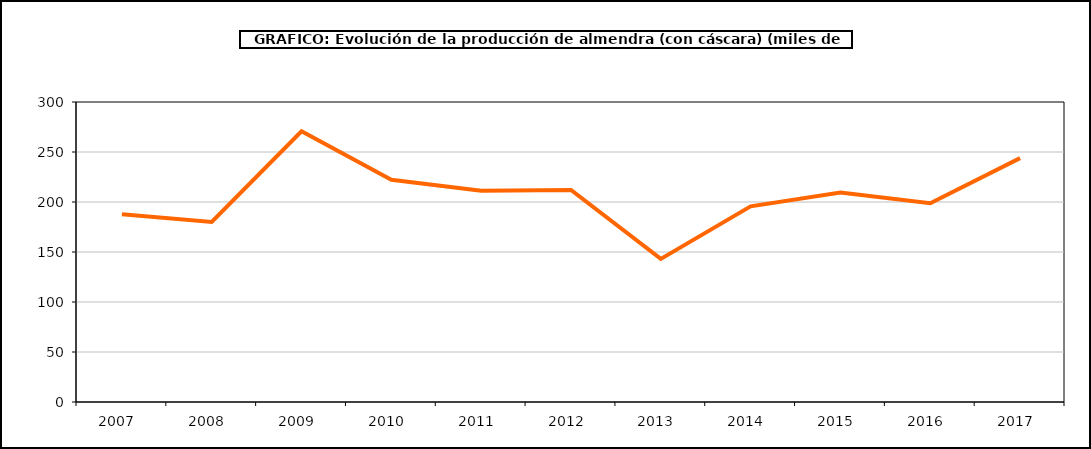
| Category | producción almendro |
|---|---|
| 2007.0 | 187.656 |
| 2008.0 | 180.103 |
| 2009.0 | 270.686 |
| 2010.0 | 222.217 |
| 2011.0 | 211.179 |
| 2012.0 | 212.063 |
| 2013.0 | 143.081 |
| 2014.0 | 195.699 |
| 2015.0 | 209.443 |
| 2016.0 | 198.767 |
| 2017.0 | 243.876 |